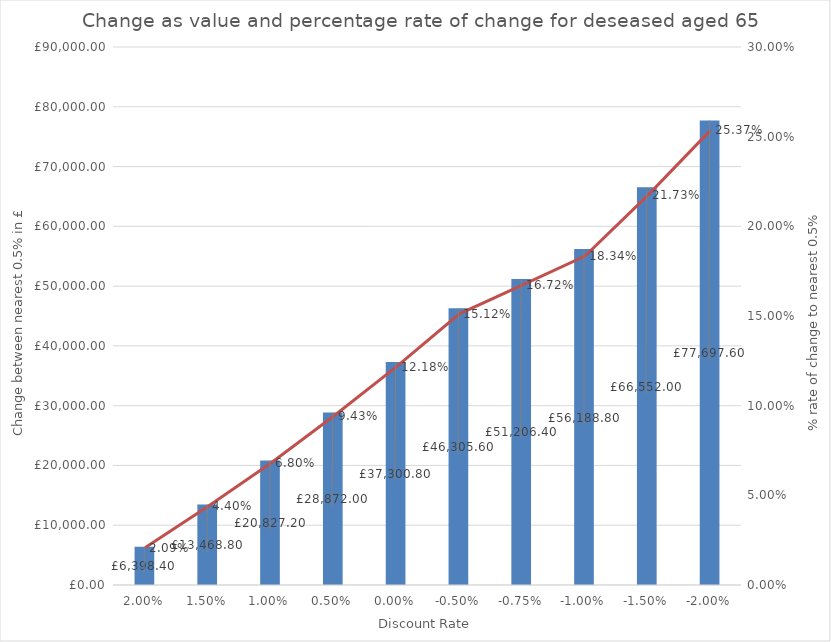
| Category | Value change |
|---|---|
| 0.02 | 6398.4 |
| 0.015 | 13468.8 |
| 0.01 | 20827.2 |
| 0.005 | 28872 |
| 0.0 | 37300.8 |
| -0.005 | 46305.6 |
| -0.0075 | 51206.4 |
| -0.01 | 56188.8 |
| -0.015 | 66552 |
| -0.02 | 77697.6 |